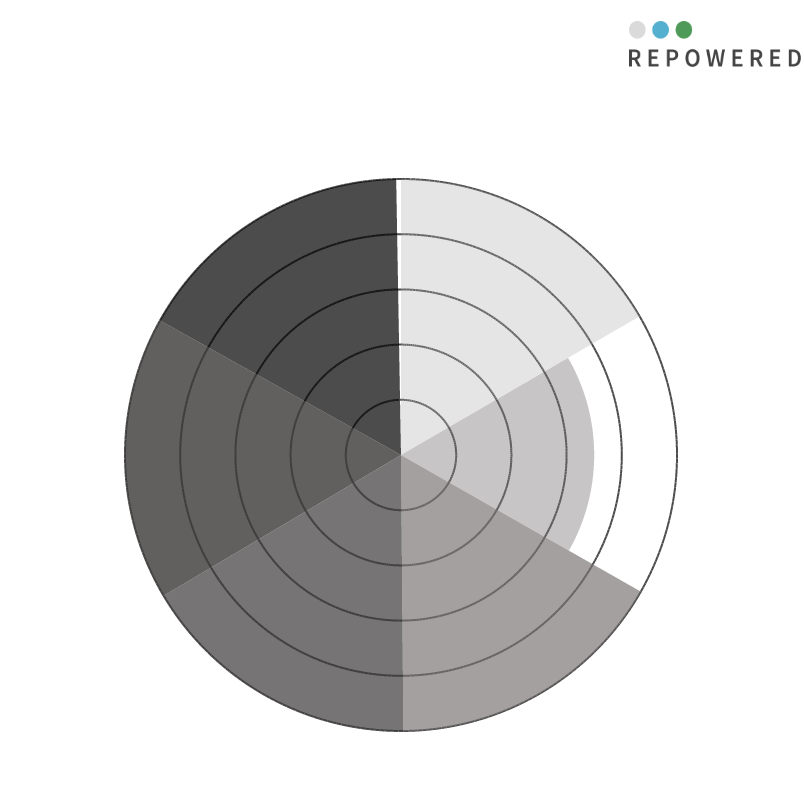
| Category | Capaciteitscongestie | Transportcongestie | Directe afnemer stroom (Grootverbruik) | Duurzame opwek aanwezig < 5 km | Vergunningsruimte zon | Vergunningsruimte wind | Blanco |
|---|---|---|---|---|---|---|---|
| 0 | 10 | 0 | 0 | 0 | 0 | 0 | 0 |
| 1 | 10 | 0 | 0 | 0 | 0 | 0 | 0 |
| 2 | 10 | 0 | 0 | 0 | 0 | 0 | 0 |
| 3 | 10 | 0 | 0 | 0 | 0 | 0 | 0 |
| 4 | 10 | 0 | 0 | 0 | 0 | 0 | 0 |
| 5 | 10 | 0 | 0 | 0 | 0 | 0 | 0 |
| 6 | 10 | 0 | 0 | 0 | 0 | 0 | 0 |
| 7 | 10 | 0 | 0 | 0 | 0 | 0 | 0 |
| 8 | 10 | 0 | 0 | 0 | 0 | 0 | 0 |
| 9 | 10 | 0 | 0 | 0 | 0 | 0 | 0 |
| 10 | 10 | 0 | 0 | 0 | 0 | 0 | 0 |
| 11 | 10 | 0 | 0 | 0 | 0 | 0 | 0 |
| 12 | 10 | 0 | 0 | 0 | 0 | 0 | 0 |
| 13 | 10 | 0 | 0 | 0 | 0 | 0 | 0 |
| 14 | 10 | 0 | 0 | 0 | 0 | 0 | 0 |
| 15 | 10 | 0 | 0 | 0 | 0 | 0 | 0 |
| 16 | 10 | 0 | 0 | 0 | 0 | 0 | 0 |
| 17 | 10 | 0 | 0 | 0 | 0 | 0 | 0 |
| 18 | 10 | 0 | 0 | 0 | 0 | 0 | 0 |
| 19 | 10 | 0 | 0 | 0 | 0 | 0 | 0 |
| 20 | 10 | 0 | 0 | 0 | 0 | 0 | 0 |
| 21 | 10 | 0 | 0 | 0 | 0 | 0 | 0 |
| 22 | 10 | 0 | 0 | 0 | 0 | 0 | 0 |
| 23 | 10 | 0 | 0 | 0 | 0 | 0 | 0 |
| 24 | 10 | 0 | 0 | 0 | 0 | 0 | 0 |
| 25 | 10 | 0 | 0 | 0 | 0 | 0 | 0 |
| 26 | 10 | 0 | 0 | 0 | 0 | 0 | 0 |
| 27 | 10 | 0 | 0 | 0 | 0 | 0 | 0 |
| 28 | 10 | 0 | 0 | 0 | 0 | 0 | 0 |
| 29 | 10 | 0 | 0 | 0 | 0 | 0 | 0 |
| 30 | 10 | 0 | 0 | 0 | 0 | 0 | 0 |
| 31 | 10 | 0 | 0 | 0 | 0 | 0 | 0 |
| 32 | 10 | 0 | 0 | 0 | 0 | 0 | 0 |
| 33 | 10 | 0 | 0 | 0 | 0 | 0 | 0 |
| 34 | 10 | 0 | 0 | 0 | 0 | 0 | 0 |
| 35 | 10 | 0 | 0 | 0 | 0 | 0 | 0 |
| 36 | 10 | 0 | 0 | 0 | 0 | 0 | 0 |
| 37 | 10 | 0 | 0 | 0 | 0 | 0 | 0 |
| 38 | 10 | 0 | 0 | 0 | 0 | 0 | 0 |
| 39 | 10 | 0 | 0 | 0 | 0 | 0 | 0 |
| 40 | 10 | 0 | 0 | 0 | 0 | 0 | 0 |
| 41 | 10 | 0 | 0 | 0 | 0 | 0 | 0 |
| 42 | 10 | 0 | 0 | 0 | 0 | 0 | 0 |
| 43 | 10 | 0 | 0 | 0 | 0 | 0 | 0 |
| 44 | 10 | 0 | 0 | 0 | 0 | 0 | 0 |
| 45 | 10 | 0 | 0 | 0 | 0 | 0 | 0 |
| 46 | 10 | 0 | 0 | 0 | 0 | 0 | 0 |
| 47 | 10 | 0 | 0 | 0 | 0 | 0 | 0 |
| 48 | 10 | 0 | 0 | 0 | 0 | 0 | 0 |
| 49 | 10 | 0 | 0 | 0 | 0 | 0 | 0 |
| 50 | 10 | 0 | 0 | 0 | 0 | 0 | 0 |
| 51 | 10 | 0 | 0 | 0 | 0 | 0 | 0 |
| 52 | 10 | 0 | 0 | 0 | 0 | 0 | 0 |
| 53 | 10 | 0 | 0 | 0 | 0 | 0 | 0 |
| 54 | 10 | 0 | 0 | 0 | 0 | 0 | 0 |
| 55 | 10 | 0 | 0 | 0 | 0 | 0 | 0 |
| 56 | 10 | 0 | 0 | 0 | 0 | 0 | 0 |
| 57 | 10 | 0 | 0 | 0 | 0 | 0 | 0 |
| 58 | 10 | 0 | 0 | 0 | 0 | 0 | 0 |
| 59 | 10 | 0 | 0 | 0 | 0 | 0 | 0 |
| 60 | 10 | 7 | 0 | 0 | 0 | 0 | 0 |
| 61 | 0 | 7 | 0 | 0 | 0 | 0 | 0 |
| 62 | 0 | 7 | 0 | 0 | 0 | 0 | 0 |
| 63 | 0 | 7 | 0 | 0 | 0 | 0 | 0 |
| 64 | 0 | 7 | 0 | 0 | 0 | 0 | 0 |
| 65 | 0 | 7 | 0 | 0 | 0 | 0 | 0 |
| 66 | 0 | 7 | 0 | 0 | 0 | 0 | 0 |
| 67 | 0 | 7 | 0 | 0 | 0 | 0 | 0 |
| 68 | 0 | 7 | 0 | 0 | 0 | 0 | 0 |
| 69 | 0 | 7 | 0 | 0 | 0 | 0 | 0 |
| 70 | 0 | 7 | 0 | 0 | 0 | 0 | 0 |
| 71 | 0 | 7 | 0 | 0 | 0 | 0 | 0 |
| 72 | 0 | 7 | 0 | 0 | 0 | 0 | 0 |
| 73 | 0 | 7 | 0 | 0 | 0 | 0 | 0 |
| 74 | 0 | 7 | 0 | 0 | 0 | 0 | 0 |
| 75 | 0 | 7 | 0 | 0 | 0 | 0 | 0 |
| 76 | 0 | 7 | 0 | 0 | 0 | 0 | 0 |
| 77 | 0 | 7 | 0 | 0 | 0 | 0 | 0 |
| 78 | 0 | 7 | 0 | 0 | 0 | 0 | 0 |
| 79 | 0 | 7 | 0 | 0 | 0 | 0 | 0 |
| 80 | 0 | 7 | 0 | 0 | 0 | 0 | 0 |
| 81 | 0 | 7 | 0 | 0 | 0 | 0 | 0 |
| 82 | 0 | 7 | 0 | 0 | 0 | 0 | 0 |
| 83 | 0 | 7 | 0 | 0 | 0 | 0 | 0 |
| 84 | 0 | 7 | 0 | 0 | 0 | 0 | 0 |
| 85 | 0 | 7 | 0 | 0 | 0 | 0 | 0 |
| 86 | 0 | 7 | 0 | 0 | 0 | 0 | 0 |
| 87 | 0 | 7 | 0 | 0 | 0 | 0 | 0 |
| 88 | 0 | 7 | 0 | 0 | 0 | 0 | 0 |
| 89 | 0 | 7 | 0 | 0 | 0 | 0 | 0 |
| 90 | 0 | 7 | 0 | 0 | 0 | 0 | 0 |
| 91 | 0 | 7 | 0 | 0 | 0 | 0 | 0 |
| 92 | 0 | 7 | 0 | 0 | 0 | 0 | 0 |
| 93 | 0 | 7 | 0 | 0 | 0 | 0 | 0 |
| 94 | 0 | 7 | 0 | 0 | 0 | 0 | 0 |
| 95 | 0 | 7 | 0 | 0 | 0 | 0 | 0 |
| 96 | 0 | 7 | 0 | 0 | 0 | 0 | 0 |
| 97 | 0 | 7 | 0 | 0 | 0 | 0 | 0 |
| 98 | 0 | 7 | 0 | 0 | 0 | 0 | 0 |
| 99 | 0 | 7 | 0 | 0 | 0 | 0 | 0 |
| 100 | 0 | 7 | 0 | 0 | 0 | 0 | 0 |
| 101 | 0 | 7 | 0 | 0 | 0 | 0 | 0 |
| 102 | 0 | 7 | 0 | 0 | 0 | 0 | 0 |
| 103 | 0 | 7 | 0 | 0 | 0 | 0 | 0 |
| 104 | 0 | 7 | 0 | 0 | 0 | 0 | 0 |
| 105 | 0 | 7 | 0 | 0 | 0 | 0 | 0 |
| 106 | 0 | 7 | 0 | 0 | 0 | 0 | 0 |
| 107 | 0 | 7 | 0 | 0 | 0 | 0 | 0 |
| 108 | 0 | 7 | 0 | 0 | 0 | 0 | 0 |
| 109 | 0 | 7 | 0 | 0 | 0 | 0 | 0 |
| 110 | 0 | 7 | 0 | 0 | 0 | 0 | 0 |
| 111 | 0 | 7 | 0 | 0 | 0 | 0 | 0 |
| 112 | 0 | 7 | 0 | 0 | 0 | 0 | 0 |
| 113 | 0 | 7 | 0 | 0 | 0 | 0 | 0 |
| 114 | 0 | 7 | 0 | 0 | 0 | 0 | 0 |
| 115 | 0 | 7 | 0 | 0 | 0 | 0 | 0 |
| 116 | 0 | 7 | 0 | 0 | 0 | 0 | 0 |
| 117 | 0 | 7 | 0 | 0 | 0 | 0 | 0 |
| 118 | 0 | 7 | 0 | 0 | 0 | 0 | 0 |
| 119 | 0 | 7 | 0 | 0 | 0 | 0 | 0 |
| 120 | 0 | 7 | 10 | 0 | 0 | 0 | 0 |
| 121 | 0 | 0 | 10 | 0 | 0 | 0 | 0 |
| 122 | 0 | 0 | 10 | 0 | 0 | 0 | 0 |
| 123 | 0 | 0 | 10 | 0 | 0 | 0 | 0 |
| 124 | 0 | 0 | 10 | 0 | 0 | 0 | 0 |
| 125 | 0 | 0 | 10 | 0 | 0 | 0 | 0 |
| 126 | 0 | 0 | 10 | 0 | 0 | 0 | 0 |
| 127 | 0 | 0 | 10 | 0 | 0 | 0 | 0 |
| 128 | 0 | 0 | 10 | 0 | 0 | 0 | 0 |
| 129 | 0 | 0 | 10 | 0 | 0 | 0 | 0 |
| 130 | 0 | 0 | 10 | 0 | 0 | 0 | 0 |
| 131 | 0 | 0 | 10 | 0 | 0 | 0 | 0 |
| 132 | 0 | 0 | 10 | 0 | 0 | 0 | 0 |
| 133 | 0 | 0 | 10 | 0 | 0 | 0 | 0 |
| 134 | 0 | 0 | 10 | 0 | 0 | 0 | 0 |
| 135 | 0 | 0 | 10 | 0 | 0 | 0 | 0 |
| 136 | 0 | 0 | 10 | 0 | 0 | 0 | 0 |
| 137 | 0 | 0 | 10 | 0 | 0 | 0 | 0 |
| 138 | 0 | 0 | 10 | 0 | 0 | 0 | 0 |
| 139 | 0 | 0 | 10 | 0 | 0 | 0 | 0 |
| 140 | 0 | 0 | 10 | 0 | 0 | 0 | 0 |
| 141 | 0 | 0 | 10 | 0 | 0 | 0 | 0 |
| 142 | 0 | 0 | 10 | 0 | 0 | 0 | 0 |
| 143 | 0 | 0 | 10 | 0 | 0 | 0 | 0 |
| 144 | 0 | 0 | 10 | 0 | 0 | 0 | 0 |
| 145 | 0 | 0 | 10 | 0 | 0 | 0 | 0 |
| 146 | 0 | 0 | 10 | 0 | 0 | 0 | 0 |
| 147 | 0 | 0 | 10 | 0 | 0 | 0 | 0 |
| 148 | 0 | 0 | 10 | 0 | 0 | 0 | 0 |
| 149 | 0 | 0 | 10 | 0 | 0 | 0 | 0 |
| 150 | 0 | 0 | 10 | 0 | 0 | 0 | 0 |
| 151 | 0 | 0 | 10 | 0 | 0 | 0 | 0 |
| 152 | 0 | 0 | 10 | 0 | 0 | 0 | 0 |
| 153 | 0 | 0 | 10 | 0 | 0 | 0 | 0 |
| 154 | 0 | 0 | 10 | 0 | 0 | 0 | 0 |
| 155 | 0 | 0 | 10 | 0 | 0 | 0 | 0 |
| 156 | 0 | 0 | 10 | 0 | 0 | 0 | 0 |
| 157 | 0 | 0 | 10 | 0 | 0 | 0 | 0 |
| 158 | 0 | 0 | 10 | 0 | 0 | 0 | 0 |
| 159 | 0 | 0 | 10 | 0 | 0 | 0 | 0 |
| 160 | 0 | 0 | 10 | 0 | 0 | 0 | 0 |
| 161 | 0 | 0 | 10 | 0 | 0 | 0 | 0 |
| 162 | 0 | 0 | 10 | 0 | 0 | 0 | 0 |
| 163 | 0 | 0 | 10 | 0 | 0 | 0 | 0 |
| 164 | 0 | 0 | 10 | 0 | 0 | 0 | 0 |
| 165 | 0 | 0 | 10 | 0 | 0 | 0 | 0 |
| 166 | 0 | 0 | 10 | 0 | 0 | 0 | 0 |
| 167 | 0 | 0 | 10 | 0 | 0 | 0 | 0 |
| 168 | 0 | 0 | 10 | 0 | 0 | 0 | 0 |
| 169 | 0 | 0 | 10 | 0 | 0 | 0 | 0 |
| 170 | 0 | 0 | 10 | 0 | 0 | 0 | 0 |
| 171 | 0 | 0 | 10 | 0 | 0 | 0 | 0 |
| 172 | 0 | 0 | 10 | 0 | 0 | 0 | 0 |
| 173 | 0 | 0 | 10 | 0 | 0 | 0 | 0 |
| 174 | 0 | 0 | 10 | 0 | 0 | 0 | 0 |
| 175 | 0 | 0 | 10 | 0 | 0 | 0 | 0 |
| 176 | 0 | 0 | 10 | 0 | 0 | 0 | 0 |
| 177 | 0 | 0 | 10 | 0 | 0 | 0 | 0 |
| 178 | 0 | 0 | 10 | 0 | 0 | 0 | 0 |
| 179 | 0 | 0 | 10 | 0 | 0 | 0 | 0 |
| 180 | 0 | 0 | 10 | 10 | 0 | 0 | 0 |
| 181 | 0 | 0 | 0 | 10 | 0 | 0 | 0 |
| 182 | 0 | 0 | 0 | 10 | 0 | 0 | 0 |
| 183 | 0 | 0 | 0 | 10 | 0 | 0 | 0 |
| 184 | 0 | 0 | 0 | 10 | 0 | 0 | 0 |
| 185 | 0 | 0 | 0 | 10 | 0 | 0 | 0 |
| 186 | 0 | 0 | 0 | 10 | 0 | 0 | 0 |
| 187 | 0 | 0 | 0 | 10 | 0 | 0 | 0 |
| 188 | 0 | 0 | 0 | 10 | 0 | 0 | 0 |
| 189 | 0 | 0 | 0 | 10 | 0 | 0 | 0 |
| 190 | 0 | 0 | 0 | 10 | 0 | 0 | 0 |
| 191 | 0 | 0 | 0 | 10 | 0 | 0 | 0 |
| 192 | 0 | 0 | 0 | 10 | 0 | 0 | 0 |
| 193 | 0 | 0 | 0 | 10 | 0 | 0 | 0 |
| 194 | 0 | 0 | 0 | 10 | 0 | 0 | 0 |
| 195 | 0 | 0 | 0 | 10 | 0 | 0 | 0 |
| 196 | 0 | 0 | 0 | 10 | 0 | 0 | 0 |
| 197 | 0 | 0 | 0 | 10 | 0 | 0 | 0 |
| 198 | 0 | 0 | 0 | 10 | 0 | 0 | 0 |
| 199 | 0 | 0 | 0 | 10 | 0 | 0 | 0 |
| 200 | 0 | 0 | 0 | 10 | 0 | 0 | 0 |
| 201 | 0 | 0 | 0 | 10 | 0 | 0 | 0 |
| 202 | 0 | 0 | 0 | 10 | 0 | 0 | 0 |
| 203 | 0 | 0 | 0 | 10 | 0 | 0 | 0 |
| 204 | 0 | 0 | 0 | 10 | 0 | 0 | 0 |
| 205 | 0 | 0 | 0 | 10 | 0 | 0 | 0 |
| 206 | 0 | 0 | 0 | 10 | 0 | 0 | 0 |
| 207 | 0 | 0 | 0 | 10 | 0 | 0 | 0 |
| 208 | 0 | 0 | 0 | 10 | 0 | 0 | 0 |
| 209 | 0 | 0 | 0 | 10 | 0 | 0 | 0 |
| 210 | 0 | 0 | 0 | 10 | 0 | 0 | 0 |
| 211 | 0 | 0 | 0 | 10 | 0 | 0 | 0 |
| 212 | 0 | 0 | 0 | 10 | 0 | 0 | 0 |
| 213 | 0 | 0 | 0 | 10 | 0 | 0 | 0 |
| 214 | 0 | 0 | 0 | 10 | 0 | 0 | 0 |
| 215 | 0 | 0 | 0 | 10 | 0 | 0 | 0 |
| 216 | 0 | 0 | 0 | 10 | 0 | 0 | 0 |
| 217 | 0 | 0 | 0 | 10 | 0 | 0 | 0 |
| 218 | 0 | 0 | 0 | 10 | 0 | 0 | 0 |
| 219 | 0 | 0 | 0 | 10 | 0 | 0 | 0 |
| 220 | 0 | 0 | 0 | 10 | 0 | 0 | 0 |
| 221 | 0 | 0 | 0 | 10 | 0 | 0 | 0 |
| 222 | 0 | 0 | 0 | 10 | 0 | 0 | 0 |
| 223 | 0 | 0 | 0 | 10 | 0 | 0 | 0 |
| 224 | 0 | 0 | 0 | 10 | 0 | 0 | 0 |
| 225 | 0 | 0 | 0 | 10 | 0 | 0 | 0 |
| 226 | 0 | 0 | 0 | 10 | 0 | 0 | 0 |
| 227 | 0 | 0 | 0 | 10 | 0 | 0 | 0 |
| 228 | 0 | 0 | 0 | 10 | 0 | 0 | 0 |
| 229 | 0 | 0 | 0 | 10 | 0 | 0 | 0 |
| 230 | 0 | 0 | 0 | 10 | 0 | 0 | 0 |
| 231 | 0 | 0 | 0 | 10 | 0 | 0 | 0 |
| 232 | 0 | 0 | 0 | 10 | 0 | 0 | 0 |
| 233 | 0 | 0 | 0 | 10 | 0 | 0 | 0 |
| 234 | 0 | 0 | 0 | 10 | 0 | 0 | 0 |
| 235 | 0 | 0 | 0 | 10 | 0 | 0 | 0 |
| 236 | 0 | 0 | 0 | 10 | 0 | 0 | 0 |
| 237 | 0 | 0 | 0 | 10 | 0 | 0 | 0 |
| 238 | 0 | 0 | 0 | 10 | 0 | 0 | 0 |
| 239 | 0 | 0 | 0 | 10 | 0 | 0 | 0 |
| 240 | 0 | 0 | 0 | 10 | 10 | 0 | 0 |
| 241 | 0 | 0 | 0 | 0 | 10 | 0 | 0 |
| 242 | 0 | 0 | 0 | 0 | 10 | 0 | 0 |
| 243 | 0 | 0 | 0 | 0 | 10 | 0 | 0 |
| 244 | 0 | 0 | 0 | 0 | 10 | 0 | 0 |
| 245 | 0 | 0 | 0 | 0 | 10 | 0 | 0 |
| 246 | 0 | 0 | 0 | 0 | 10 | 0 | 0 |
| 247 | 0 | 0 | 0 | 0 | 10 | 0 | 0 |
| 248 | 0 | 0 | 0 | 0 | 10 | 0 | 0 |
| 249 | 0 | 0 | 0 | 0 | 10 | 0 | 0 |
| 250 | 0 | 0 | 0 | 0 | 10 | 0 | 0 |
| 251 | 0 | 0 | 0 | 0 | 10 | 0 | 0 |
| 252 | 0 | 0 | 0 | 0 | 10 | 0 | 0 |
| 253 | 0 | 0 | 0 | 0 | 10 | 0 | 0 |
| 254 | 0 | 0 | 0 | 0 | 10 | 0 | 0 |
| 255 | 0 | 0 | 0 | 0 | 10 | 0 | 0 |
| 256 | 0 | 0 | 0 | 0 | 10 | 0 | 0 |
| 257 | 0 | 0 | 0 | 0 | 10 | 0 | 0 |
| 258 | 0 | 0 | 0 | 0 | 10 | 0 | 0 |
| 259 | 0 | 0 | 0 | 0 | 10 | 0 | 0 |
| 260 | 0 | 0 | 0 | 0 | 10 | 0 | 0 |
| 261 | 0 | 0 | 0 | 0 | 10 | 0 | 0 |
| 262 | 0 | 0 | 0 | 0 | 10 | 0 | 0 |
| 263 | 0 | 0 | 0 | 0 | 10 | 0 | 0 |
| 264 | 0 | 0 | 0 | 0 | 10 | 0 | 0 |
| 265 | 0 | 0 | 0 | 0 | 10 | 0 | 0 |
| 266 | 0 | 0 | 0 | 0 | 10 | 0 | 0 |
| 267 | 0 | 0 | 0 | 0 | 10 | 0 | 0 |
| 268 | 0 | 0 | 0 | 0 | 10 | 0 | 0 |
| 269 | 0 | 0 | 0 | 0 | 10 | 0 | 0 |
| 270 | 0 | 0 | 0 | 0 | 10 | 0 | 0 |
| 271 | 0 | 0 | 0 | 0 | 10 | 0 | 0 |
| 272 | 0 | 0 | 0 | 0 | 10 | 0 | 0 |
| 273 | 0 | 0 | 0 | 0 | 10 | 0 | 0 |
| 274 | 0 | 0 | 0 | 0 | 10 | 0 | 0 |
| 275 | 0 | 0 | 0 | 0 | 10 | 0 | 0 |
| 276 | 0 | 0 | 0 | 0 | 10 | 0 | 0 |
| 277 | 0 | 0 | 0 | 0 | 10 | 0 | 0 |
| 278 | 0 | 0 | 0 | 0 | 10 | 0 | 0 |
| 279 | 0 | 0 | 0 | 0 | 10 | 0 | 0 |
| 280 | 0 | 0 | 0 | 0 | 10 | 0 | 0 |
| 281 | 0 | 0 | 0 | 0 | 10 | 0 | 0 |
| 282 | 0 | 0 | 0 | 0 | 10 | 0 | 0 |
| 283 | 0 | 0 | 0 | 0 | 10 | 0 | 0 |
| 284 | 0 | 0 | 0 | 0 | 10 | 0 | 0 |
| 285 | 0 | 0 | 0 | 0 | 10 | 0 | 0 |
| 286 | 0 | 0 | 0 | 0 | 10 | 0 | 0 |
| 287 | 0 | 0 | 0 | 0 | 10 | 0 | 0 |
| 288 | 0 | 0 | 0 | 0 | 10 | 0 | 0 |
| 289 | 0 | 0 | 0 | 0 | 10 | 0 | 0 |
| 290 | 0 | 0 | 0 | 0 | 10 | 0 | 0 |
| 291 | 0 | 0 | 0 | 0 | 10 | 0 | 0 |
| 292 | 0 | 0 | 0 | 0 | 10 | 0 | 0 |
| 293 | 0 | 0 | 0 | 0 | 10 | 0 | 0 |
| 294 | 0 | 0 | 0 | 0 | 10 | 0 | 0 |
| 295 | 0 | 0 | 0 | 0 | 10 | 0 | 0 |
| 296 | 0 | 0 | 0 | 0 | 10 | 0 | 0 |
| 297 | 0 | 0 | 0 | 0 | 10 | 0 | 0 |
| 298 | 0 | 0 | 0 | 0 | 10 | 0 | 0 |
| 299 | 0 | 0 | 0 | 0 | 10 | 0 | 0 |
| 300 | 0 | 0 | 0 | 0 | 10 | 10 | 0 |
| 301 | 0 | 0 | 0 | 0 | 0 | 10 | 0 |
| 302 | 0 | 0 | 0 | 0 | 0 | 10 | 0 |
| 303 | 0 | 0 | 0 | 0 | 0 | 10 | 0 |
| 304 | 0 | 0 | 0 | 0 | 0 | 10 | 0 |
| 305 | 0 | 0 | 0 | 0 | 0 | 10 | 0 |
| 306 | 0 | 0 | 0 | 0 | 0 | 10 | 0 |
| 307 | 0 | 0 | 0 | 0 | 0 | 10 | 0 |
| 308 | 0 | 0 | 0 | 0 | 0 | 10 | 0 |
| 309 | 0 | 0 | 0 | 0 | 0 | 10 | 0 |
| 310 | 0 | 0 | 0 | 0 | 0 | 10 | 0 |
| 311 | 0 | 0 | 0 | 0 | 0 | 10 | 0 |
| 312 | 0 | 0 | 0 | 0 | 0 | 10 | 0 |
| 313 | 0 | 0 | 0 | 0 | 0 | 10 | 0 |
| 314 | 0 | 0 | 0 | 0 | 0 | 10 | 0 |
| 315 | 0 | 0 | 0 | 0 | 0 | 10 | 0 |
| 316 | 0 | 0 | 0 | 0 | 0 | 10 | 0 |
| 317 | 0 | 0 | 0 | 0 | 0 | 10 | 0 |
| 318 | 0 | 0 | 0 | 0 | 0 | 10 | 0 |
| 319 | 0 | 0 | 0 | 0 | 0 | 10 | 0 |
| 320 | 0 | 0 | 0 | 0 | 0 | 10 | 0 |
| 321 | 0 | 0 | 0 | 0 | 0 | 10 | 0 |
| 322 | 0 | 0 | 0 | 0 | 0 | 10 | 0 |
| 323 | 0 | 0 | 0 | 0 | 0 | 10 | 0 |
| 324 | 0 | 0 | 0 | 0 | 0 | 10 | 0 |
| 325 | 0 | 0 | 0 | 0 | 0 | 10 | 0 |
| 326 | 0 | 0 | 0 | 0 | 0 | 10 | 0 |
| 327 | 0 | 0 | 0 | 0 | 0 | 10 | 0 |
| 328 | 0 | 0 | 0 | 0 | 0 | 10 | 0 |
| 329 | 0 | 0 | 0 | 0 | 0 | 10 | 0 |
| 330 | 0 | 0 | 0 | 0 | 0 | 10 | 0 |
| 331 | 0 | 0 | 0 | 0 | 0 | 10 | 0 |
| 332 | 0 | 0 | 0 | 0 | 0 | 10 | 0 |
| 333 | 0 | 0 | 0 | 0 | 0 | 10 | 0 |
| 334 | 0 | 0 | 0 | 0 | 0 | 10 | 0 |
| 335 | 0 | 0 | 0 | 0 | 0 | 10 | 0 |
| 336 | 0 | 0 | 0 | 0 | 0 | 10 | 0 |
| 337 | 0 | 0 | 0 | 0 | 0 | 10 | 0 |
| 338 | 0 | 0 | 0 | 0 | 0 | 10 | 0 |
| 339 | 0 | 0 | 0 | 0 | 0 | 10 | 0 |
| 340 | 0 | 0 | 0 | 0 | 0 | 10 | 0 |
| 341 | 0 | 0 | 0 | 0 | 0 | 10 | 0 |
| 342 | 0 | 0 | 0 | 0 | 0 | 10 | 0 |
| 343 | 0 | 0 | 0 | 0 | 0 | 10 | 0 |
| 344 | 0 | 0 | 0 | 0 | 0 | 10 | 0 |
| 345 | 0 | 0 | 0 | 0 | 0 | 10 | 0 |
| 346 | 0 | 0 | 0 | 0 | 0 | 10 | 0 |
| 347 | 0 | 0 | 0 | 0 | 0 | 10 | 0 |
| 348 | 0 | 0 | 0 | 0 | 0 | 10 | 0 |
| 349 | 0 | 0 | 0 | 0 | 0 | 10 | 0 |
| 350 | 0 | 0 | 0 | 0 | 0 | 10 | 0 |
| 351 | 0 | 0 | 0 | 0 | 0 | 10 | 0 |
| 352 | 0 | 0 | 0 | 0 | 0 | 10 | 0 |
| 353 | 0 | 0 | 0 | 0 | 0 | 10 | 0 |
| 354 | 0 | 0 | 0 | 0 | 0 | 10 | 0 |
| 355 | 0 | 0 | 0 | 0 | 0 | 10 | 0 |
| 356 | 0 | 0 | 0 | 0 | 0 | 10 | 0 |
| 357 | 0 | 0 | 0 | 0 | 0 | 10 | 0 |
| 358 | 0 | 0 | 0 | 0 | 0 | 10 | 0 |
| 359 | 0 | 0 | 0 | 0 | 0 | 10 | 0 |
| 360 | 0 | 0 | 0 | 0 | 0 | 10 | 10 |